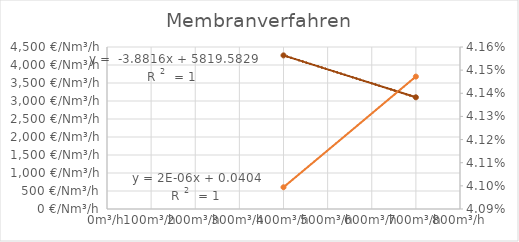
| Category | spez. Anschaffungskosten |
|---|---|
| 400.0 | 4266.96 |
| 700.0 | 3102.493 |